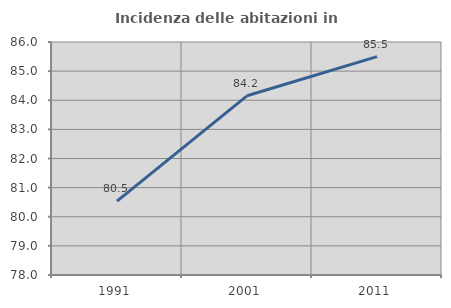
| Category | Incidenza delle abitazioni in proprietà  |
|---|---|
| 1991.0 | 80.534 |
| 2001.0 | 84.153 |
| 2011.0 | 85.498 |